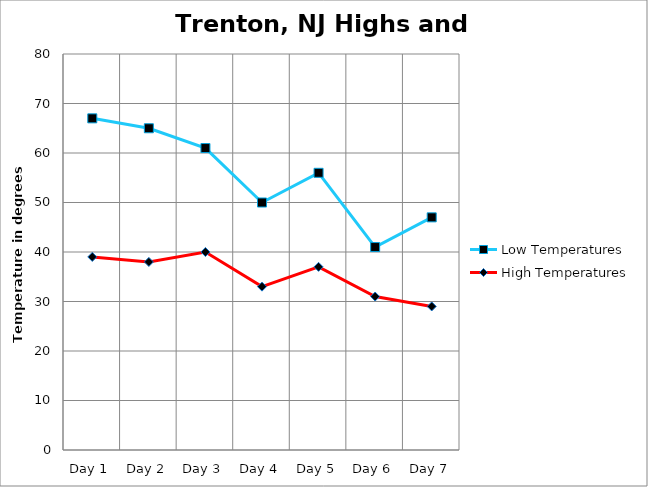
| Category | High Temperatures | Low Temperatures |
|---|---|---|
| Day 1 | 39 | 28 |
| Day 2 | 38 | 27 |
| Day 3 | 40 | 21 |
| Day 4 | 33 | 17 |
| Day 5 | 37 | 19 |
| Day 6 | 31 | 10 |
| Day 7 | 29 | 18 |